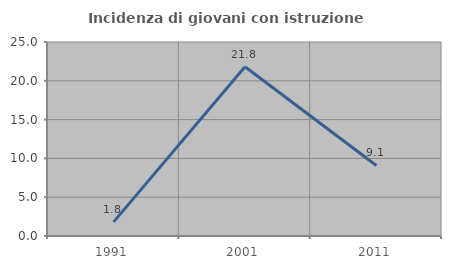
| Category | Incidenza di giovani con istruzione universitaria |
|---|---|
| 1991.0 | 1.818 |
| 2001.0 | 21.818 |
| 2011.0 | 9.091 |